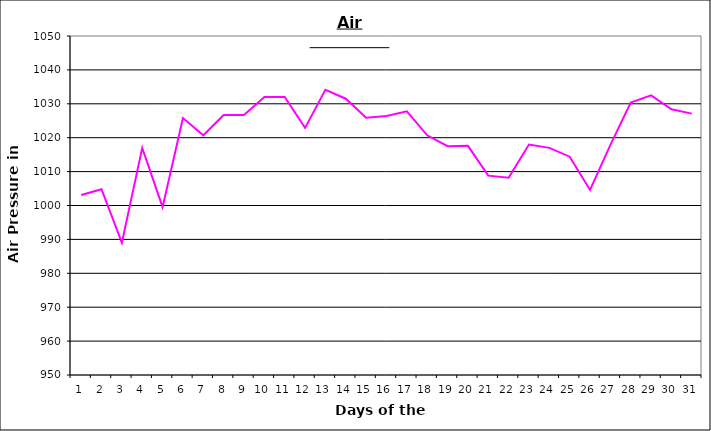
| Category | Series 0 |
|---|---|
| 0 | 1003.1 |
| 1 | 1004.8 |
| 2 | 989 |
| 3 | 1017 |
| 4 | 999.5 |
| 5 | 1025.8 |
| 6 | 1020.7 |
| 7 | 1026.7 |
| 8 | 1026.7 |
| 9 | 1032 |
| 10 | 1032 |
| 11 | 1022.9 |
| 12 | 1034.1 |
| 13 | 1031.5 |
| 14 | 1025.9 |
| 15 | 1026.4 |
| 16 | 1027.8 |
| 17 | 1020.7 |
| 18 | 1017.5 |
| 19 | 1017.6 |
| 20 | 1008.8 |
| 21 | 1008.2 |
| 22 | 1018 |
| 23 | 1017 |
| 24 | 1014.4 |
| 25 | 1004.6 |
| 26 | 1017.9 |
| 27 | 1030.4 |
| 28 | 1032.5 |
| 29 | 1028.4 |
| 30 | 1027.1 |